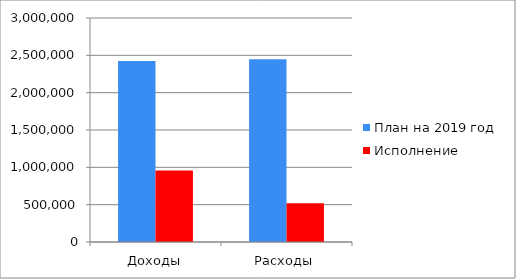
| Category | План на 2019 год | Исполнение |
|---|---|---|
| Доходы | 2423295.15 | 956761.15 |
| Расходы | 2449058.9 | 519846.9 |